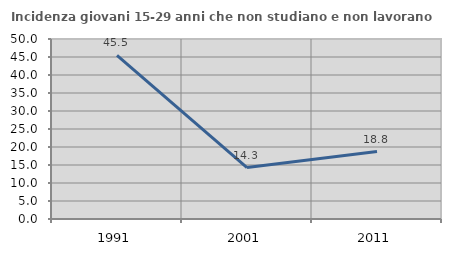
| Category | Incidenza giovani 15-29 anni che non studiano e non lavorano  |
|---|---|
| 1991.0 | 45.455 |
| 2001.0 | 14.286 |
| 2011.0 | 18.75 |